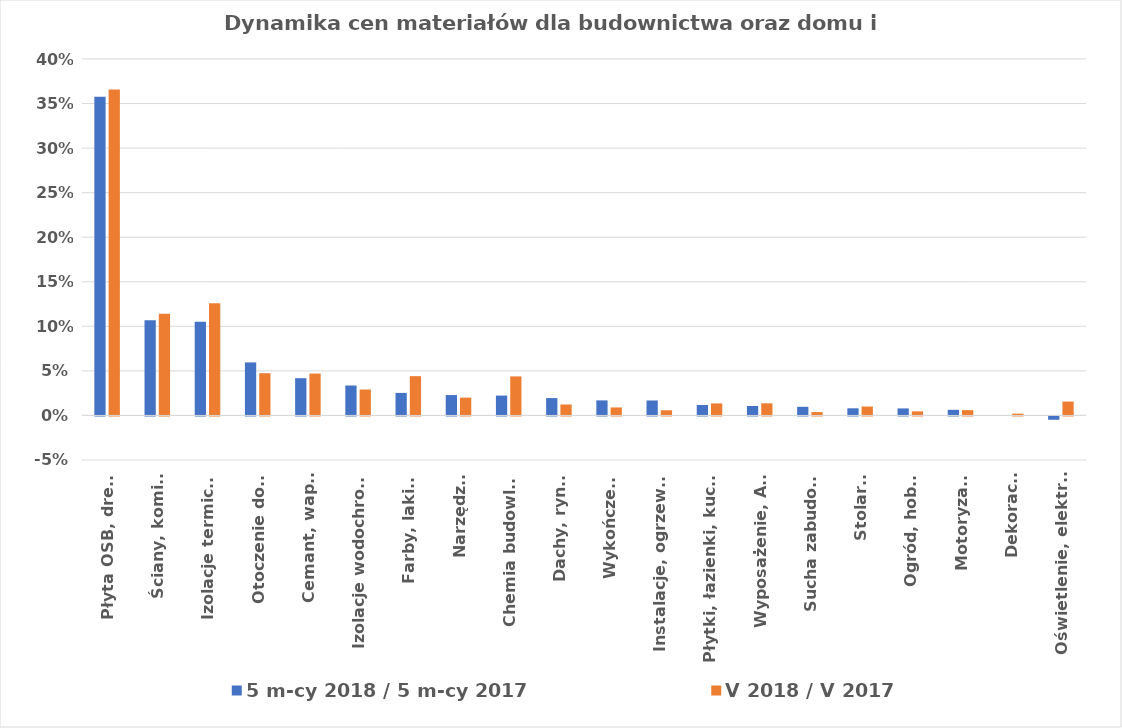
| Category | 5 m-cy 2018 / 5 m-cy 2017 | V 2018 / V 2017 |
|---|---|---|
| Płyta OSB, drewno | 0.358 | 0.366 |
| Ściany, kominy | 0.107 | 0.114 |
| Izolacje termiczne | 0.105 | 0.126 |
| Otoczenie domu | 0.06 | 0.047 |
| Cemant, wapno | 0.042 | 0.047 |
| Izolacje wodochronne | 0.034 | 0.029 |
| Farby, lakiery | 0.025 | 0.044 |
| Narzędzia | 0.023 | 0.02 |
| Chemia budowlana | 0.022 | 0.044 |
| Dachy, rynny | 0.02 | 0.012 |
| Wykończenia | 0.017 | 0.009 |
| Instalacje, ogrzewanie | 0.017 | 0.006 |
| Płytki, łazienki, kuchnie | 0.012 | 0.014 |
| Wyposażenie, AGD | 0.011 | 0.014 |
| Sucha zabudowa | 0.01 | 0.004 |
| Stolarka | 0.008 | 0.01 |
| Ogród, hobby | 0.008 | 0.005 |
| Motoryzacja | 0.006 | 0.006 |
| Dekoracje | 0 | 0.002 |
| Oświetlenie, elektryka | -0.004 | 0.016 |